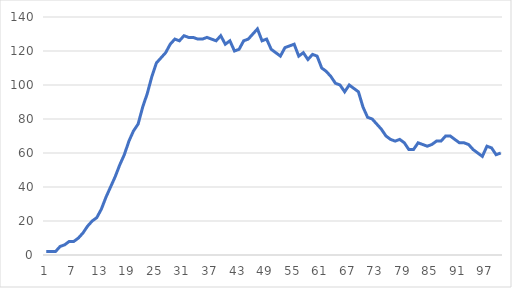
| Category | Series 0 |
|---|---|
| 0 | 2 |
| 1 | 2 |
| 2 | 2 |
| 3 | 5 |
| 4 | 6 |
| 5 | 8 |
| 6 | 8 |
| 7 | 10 |
| 8 | 13 |
| 9 | 17 |
| 10 | 20 |
| 11 | 22 |
| 12 | 27 |
| 13 | 34 |
| 14 | 40 |
| 15 | 46 |
| 16 | 53 |
| 17 | 59 |
| 18 | 67 |
| 19 | 73 |
| 20 | 77 |
| 21 | 87 |
| 22 | 95 |
| 23 | 105 |
| 24 | 113 |
| 25 | 116 |
| 26 | 119 |
| 27 | 124 |
| 28 | 127 |
| 29 | 126 |
| 30 | 129 |
| 31 | 128 |
| 32 | 128 |
| 33 | 127 |
| 34 | 127 |
| 35 | 128 |
| 36 | 127 |
| 37 | 126 |
| 38 | 129 |
| 39 | 124 |
| 40 | 126 |
| 41 | 120 |
| 42 | 121 |
| 43 | 126 |
| 44 | 127 |
| 45 | 130 |
| 46 | 133 |
| 47 | 126 |
| 48 | 127 |
| 49 | 121 |
| 50 | 119 |
| 51 | 117 |
| 52 | 122 |
| 53 | 123 |
| 54 | 124 |
| 55 | 117 |
| 56 | 119 |
| 57 | 115 |
| 58 | 118 |
| 59 | 117 |
| 60 | 110 |
| 61 | 108 |
| 62 | 105 |
| 63 | 101 |
| 64 | 100 |
| 65 | 96 |
| 66 | 100 |
| 67 | 98 |
| 68 | 96 |
| 69 | 87 |
| 70 | 81 |
| 71 | 80 |
| 72 | 77 |
| 73 | 74 |
| 74 | 70 |
| 75 | 68 |
| 76 | 67 |
| 77 | 68 |
| 78 | 66 |
| 79 | 62 |
| 80 | 62 |
| 81 | 66 |
| 82 | 65 |
| 83 | 64 |
| 84 | 65 |
| 85 | 67 |
| 86 | 67 |
| 87 | 70 |
| 88 | 70 |
| 89 | 68 |
| 90 | 66 |
| 91 | 66 |
| 92 | 65 |
| 93 | 62 |
| 94 | 60 |
| 95 | 58 |
| 96 | 64 |
| 97 | 63 |
| 98 | 59 |
| 99 | 60 |